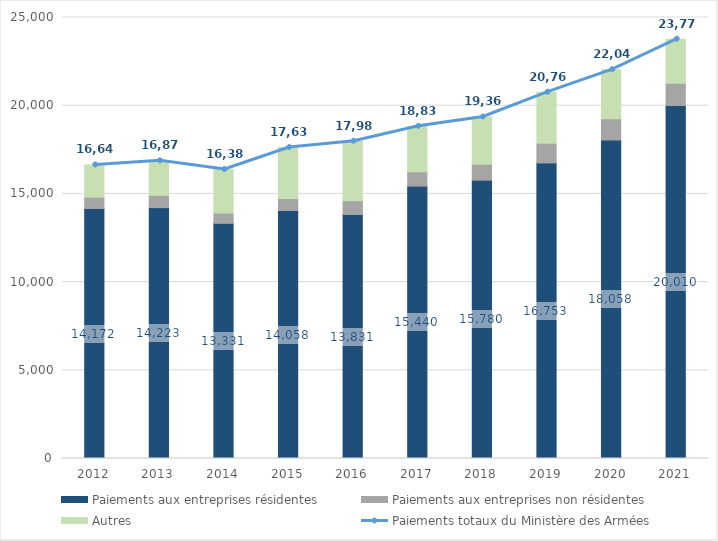
| Category | Paiements aux entreprises résidentes | Paiements aux entreprises non résidentes | Autres |
|---|---|---|---|
| 2012.0 | 14172 | 647 | 1821 |
| 2013.0 | 14223 | 696 | 1958 |
| 2014.0 | 13331 | 585 | 2465 |
| 2015.0 | 14058 | 676 | 2896 |
| 2016.0 | 13831 | 784 | 3373 |
| 2017.0 | 15440 | 821 | 2573 |
| 2018.0 | 15780 | 898 | 2685 |
| 2019.0 | 16753 | 1114 | 2900 |
| 2020.0 | 18058 | 1197 | 2787 |
| 2021.0 | 20010 | 1260 | 2503 |